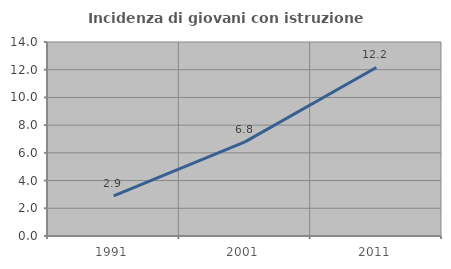
| Category | Incidenza di giovani con istruzione universitaria |
|---|---|
| 1991.0 | 2.899 |
| 2001.0 | 6.796 |
| 2011.0 | 12.162 |